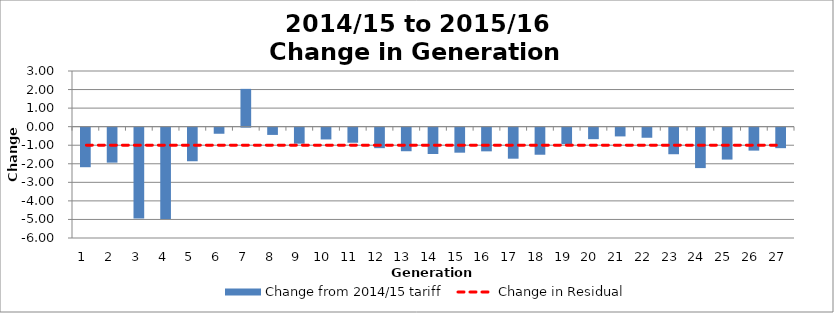
| Category | Change from 2014/15 tariff |
|---|---|
| 1.0 | -2.131 |
| 2.0 | -1.885 |
| 3.0 | -4.897 |
| 4.0 | -4.921 |
| 5.0 | -1.81 |
| 6.0 | -0.328 |
| 7.0 | 2.038 |
| 8.0 | -0.391 |
| 9.0 | -0.864 |
| 10.0 | -0.634 |
| 11.0 | -0.812 |
| 12.0 | -1.105 |
| 13.0 | -1.27 |
| 14.0 | -1.418 |
| 15.0 | -1.348 |
| 16.0 | -1.276 |
| 17.0 | -1.672 |
| 18.0 | -1.459 |
| 19.0 | -0.888 |
| 20.0 | -0.62 |
| 21.0 | -0.471 |
| 22.0 | -0.544 |
| 23.0 | -1.432 |
| 24.0 | -2.178 |
| 25.0 | -1.719 |
| 26.0 | -1.237 |
| 27.0 | -1.105 |